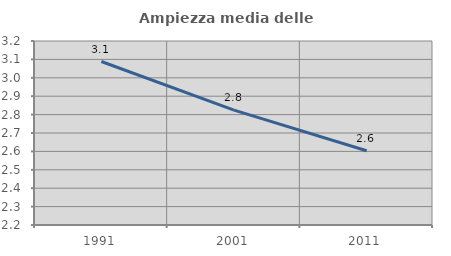
| Category | Ampiezza media delle famiglie |
|---|---|
| 1991.0 | 3.088 |
| 2001.0 | 2.825 |
| 2011.0 | 2.604 |